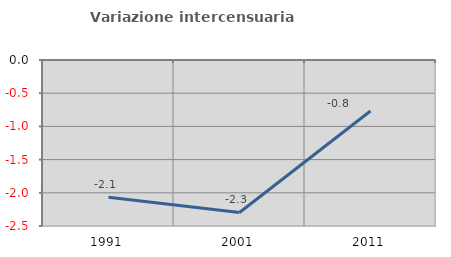
| Category | Variazione intercensuaria annua |
|---|---|
| 1991.0 | -2.069 |
| 2001.0 | -2.296 |
| 2011.0 | -0.768 |